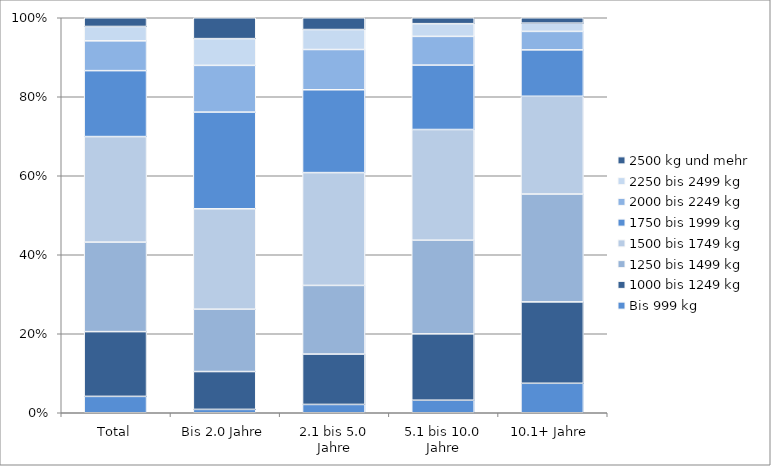
| Category | Bis 999 kg | 1000 bis 1249 kg | 1250 bis 1499 kg | 1500 bis 1749 kg | 1750 bis 1999 kg | 2000 bis 2249 kg | 2250 bis 2499 kg | 2500 kg und mehr |
|---|---|---|---|---|---|---|---|---|
| Total | 1266 | 5007 | 6920 | 8159 | 5098 | 2303 | 1110 | 675 |
| Bis 2.0 Jahre | 30 | 337 | 555 | 894 | 861 | 416 | 238 | 186 |
| 2.1 bis 5.0 Jahre | 139 | 842 | 1148 | 1886 | 1385 | 673 | 334 | 197 |
| 5.1 bis 10.0 Jahre | 316 | 1672 | 2360 | 2789 | 1623 | 724 | 320 | 149 |
| 10.1+ Jahre | 781 | 2156 | 2857 | 2590 | 1229 | 490 | 218 | 143 |